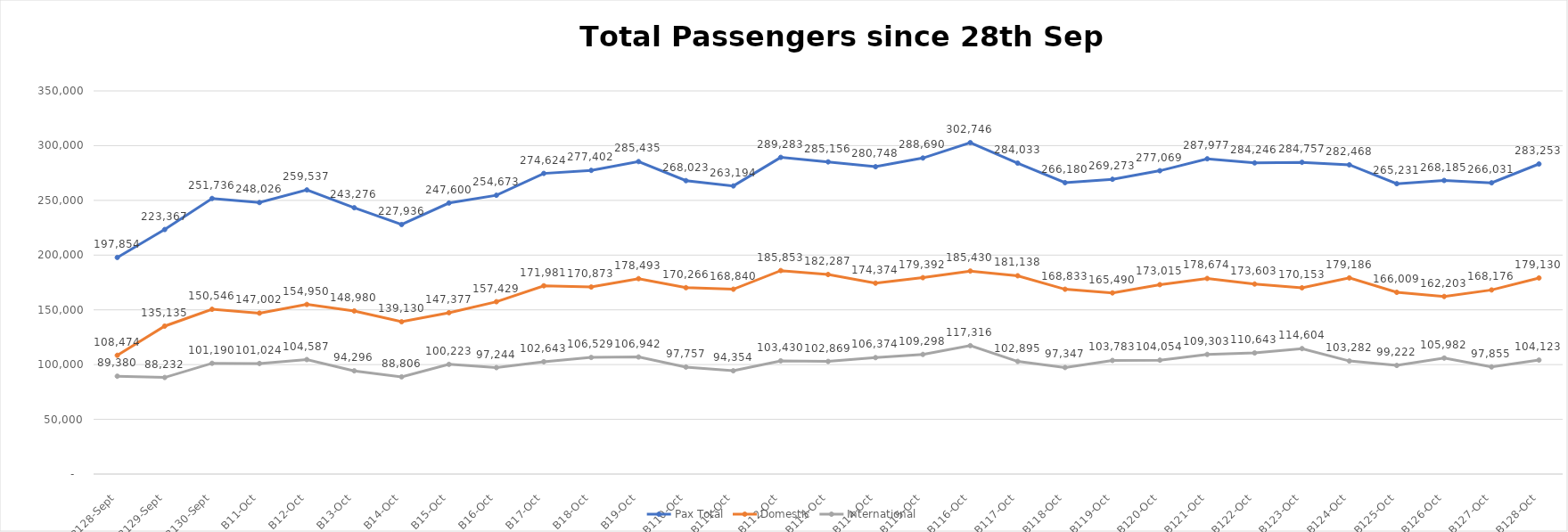
| Category | Pax Total |  Domestic  |  International  |
|---|---|---|---|
| 2022-09-28 | 197854 | 108474 | 89380 |
| 2022-09-29 | 223367 | 135135 | 88232 |
| 2022-09-30 | 251736 | 150546 | 101190 |
| 2022-10-01 | 248026 | 147002 | 101024 |
| 2022-10-02 | 259537 | 154950 | 104587 |
| 2022-10-03 | 243276 | 148980 | 94296 |
| 2022-10-04 | 227936 | 139130 | 88806 |
| 2022-10-05 | 247600 | 147377 | 100223 |
| 2022-10-06 | 254673 | 157429 | 97244 |
| 2022-10-07 | 274624 | 171981 | 102643 |
| 2022-10-08 | 277402 | 170873 | 106529 |
| 2022-10-09 | 285435 | 178493 | 106942 |
| 2022-10-10 | 268023 | 170266 | 97757 |
| 2022-10-11 | 263194 | 168840 | 94354 |
| 2022-10-12 | 289283 | 185853 | 103430 |
| 2022-10-13 | 285156 | 182287 | 102869 |
| 2022-10-14 | 280748 | 174374 | 106374 |
| 2022-10-15 | 288690 | 179392 | 109298 |
| 2022-10-16 | 302746 | 185430 | 117316 |
| 2022-10-17 | 284033 | 181138 | 102895 |
| 2022-10-18 | 266180 | 168833 | 97347 |
| 2022-10-19 | 269273 | 165490 | 103783 |
| 2022-10-20 | 277069 | 173015 | 104054 |
| 2022-10-21 | 287977 | 178674 | 109303 |
| 2022-10-22 | 284246 | 173603 | 110643 |
| 2022-10-23 | 284757 | 170153 | 114604 |
| 2022-10-24 | 282468 | 179186 | 103282 |
| 2022-10-25 | 265231 | 166009 | 99222 |
| 2022-10-26 | 268185 | 162203 | 105982 |
| 2022-10-27 | 266031 | 168176 | 97855 |
| 2022-10-28 | 283253 | 179130 | 104123 |